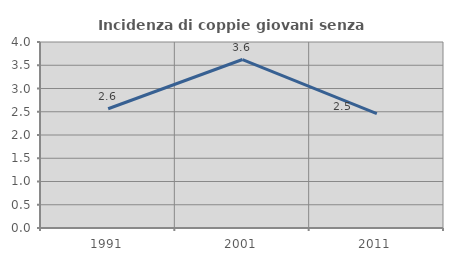
| Category | Incidenza di coppie giovani senza figli |
|---|---|
| 1991.0 | 2.564 |
| 2001.0 | 3.623 |
| 2011.0 | 2.459 |